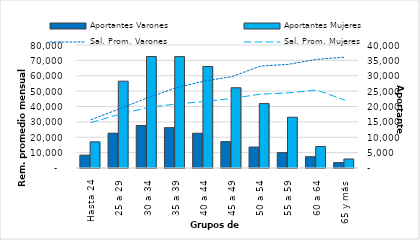
| Category | Aportantes Varones | Aportantes Mujeres |
|---|---|---|
| Hasta 24 | 4183 | 8507 |
| 25 a 29 | 11329 | 28231 |
| 30 a 34 | 13812 | 36250 |
| 35 a 39 | 13130 | 36222 |
| 40 a 44 | 11309 | 33014 |
| 45 a 49 | 8578 | 26094 |
| 50 a 54 | 6818 | 20958 |
| 55 a 59 | 5004 | 16510 |
| 60 a 64 | 3669 | 6992 |
| 65 y más | 1755 | 2934 |